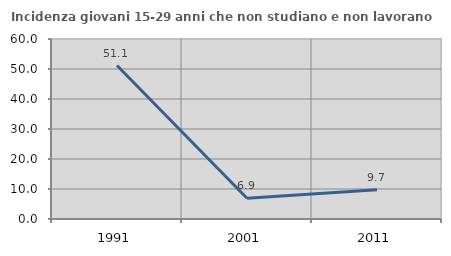
| Category | Incidenza giovani 15-29 anni che non studiano e non lavorano  |
|---|---|
| 1991.0 | 51.148 |
| 2001.0 | 6.931 |
| 2011.0 | 9.722 |